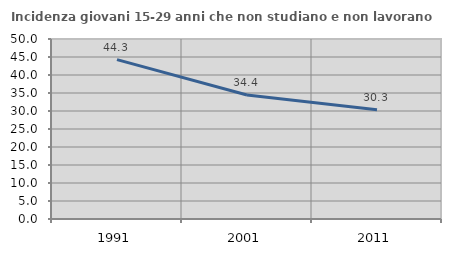
| Category | Incidenza giovani 15-29 anni che non studiano e non lavorano  |
|---|---|
| 1991.0 | 44.271 |
| 2001.0 | 34.447 |
| 2011.0 | 30.343 |